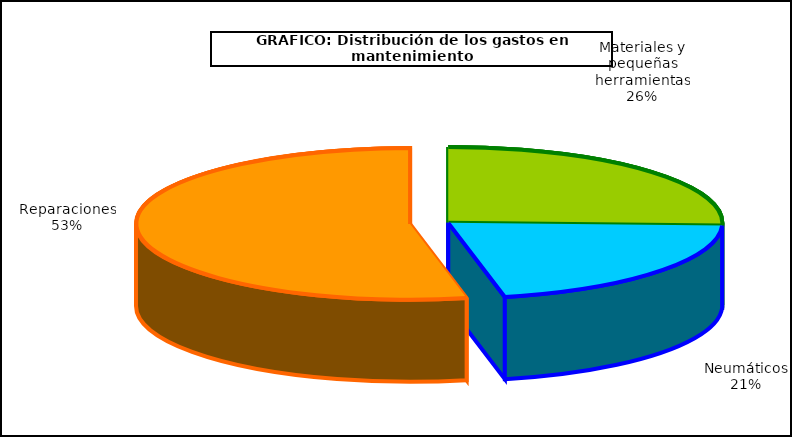
| Category | Series 0 |
|---|---|
| 0 | 388.157 |
| 1 | 320.812 |
| 2 | 809.477 |